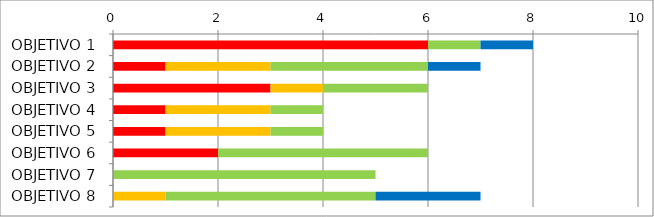
| Category | Series 0 | Series 1 | Series 2 | Series 3 | Series 4 | Series 5 |
|---|---|---|---|---|---|---|
| OBJETIVO 1 | 0 | 0 | 6 | 0 | 1 | 1 |
| OBJETIVO 2 | 0 | 0 | 1 | 2 | 3 | 1 |
| OBJETIVO 3 | 0 | 0 | 3 | 1 | 2 | 0 |
| OBJETIVO 4 | 0 | 0 | 1 | 2 | 1 | 0 |
| OBJETIVO 5 | 0 | 0 | 1 | 2 | 1 | 0 |
| OBJETIVO 6 | 0 | 0 | 2 | 0 | 4 | 0 |
| OBJETIVO 7 | 0 | 0 | 0 | 0 | 5 | 0 |
| OBJETIVO 8 | 0 | 0 | 0 | 1 | 4 | 2 |